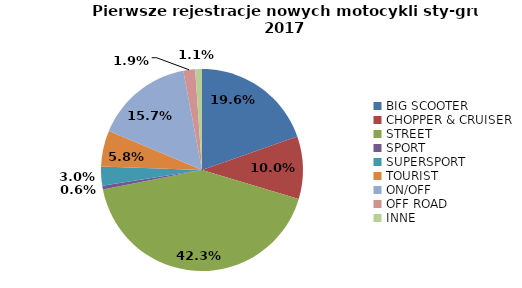
| Category | Series 0 |
|---|---|
| 0 | 2951 |
| 1 | 1504 |
| 2 | 6355 |
| 3 | 90 |
| 4 | 458 |
| 5 | 866 |
| 6 | 2361 |
| 7 | 285 |
| 8 | 162 |